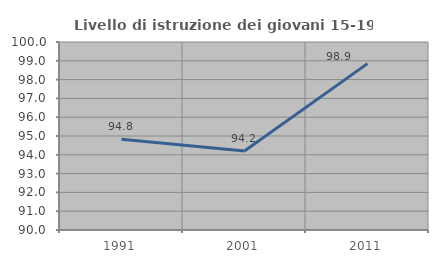
| Category | Livello di istruzione dei giovani 15-19 anni |
|---|---|
| 1991.0 | 94.828 |
| 2001.0 | 94.203 |
| 2011.0 | 98.851 |